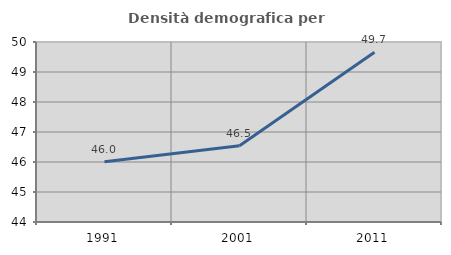
| Category | Densità demografica |
|---|---|
| 1991.0 | 46.009 |
| 2001.0 | 46.544 |
| 2011.0 | 49.657 |